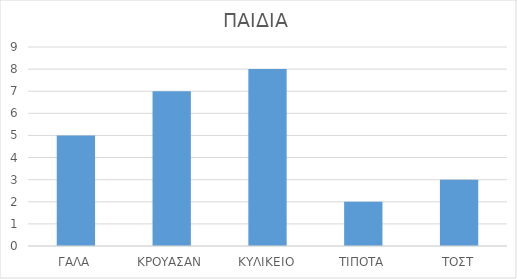
| Category | ΠΑΙΔΙΑ |
|---|---|
| ΓΑΛΑ | 5 |
| ΚΡΟΥΑΣΑΝ | 7 |
| ΚΥΛΙΚΕΙΟ | 8 |
| ΤΙΠΟΤΑ | 2 |
| ΤΟΣΤ | 3 |